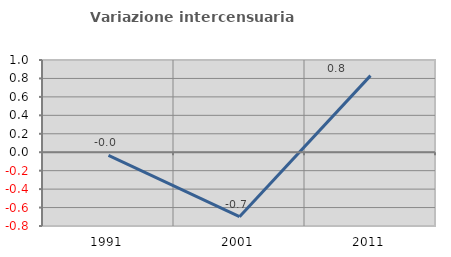
| Category | Variazione intercensuaria annua |
|---|---|
| 1991.0 | -0.034 |
| 2001.0 | -0.699 |
| 2011.0 | 0.831 |